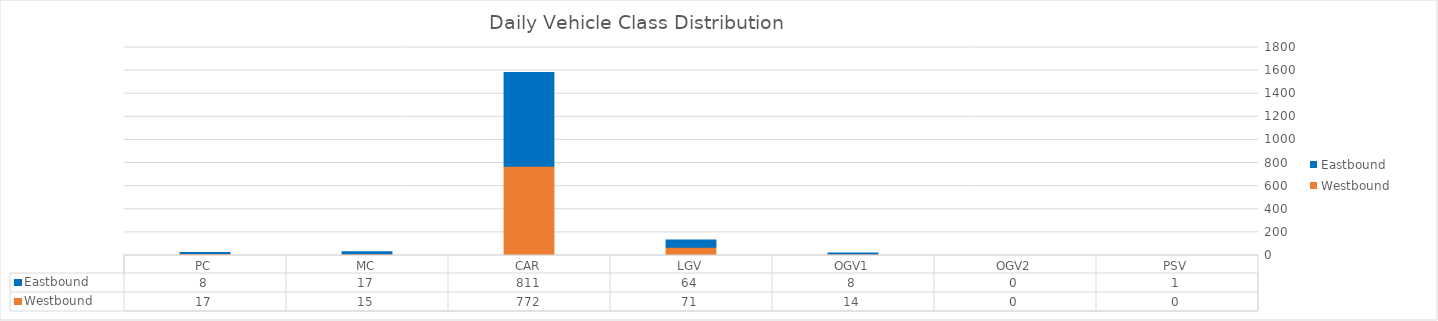
| Category | Westbound | Eastbound |
|---|---|---|
| PC | 17 | 8 |
| MC | 15 | 17 |
| CAR | 772 | 811 |
| LGV | 71 | 64 |
| OGV1 | 14 | 8 |
| OGV2 | 0 | 0 |
| PSV | 0 | 1 |